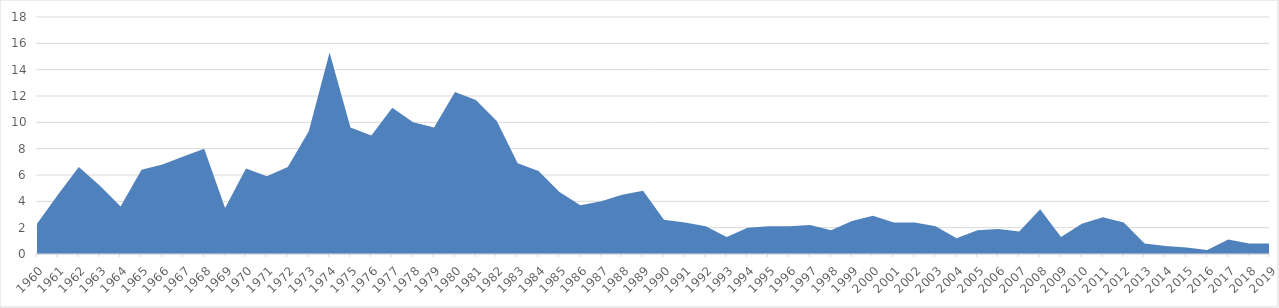
| Category | Series 0 |
|---|---|
| 1960 | 2.3 |
| 1961 | 4.5 |
| 1962 | 6.6 |
| 1963 | 5.2 |
| 1964 | 3.6 |
| 1965 | 6.4 |
| 1966 | 6.8 |
| 1967 | 7.4 |
| 1968 | 8 |
| 1969 | 3.5 |
| 1970 | 6.5 |
| 1971 | 5.9 |
| 1972 | 6.6 |
| 1973 | 9.3 |
| 1974 | 15.3 |
| 1975 | 9.6 |
| 1976 | 9 |
| 1977 | 11.1 |
| 1978 | 10 |
| 1979 | 9.6 |
| 1980 | 12.3 |
| 1981 | 11.7 |
| 1982 | 10.1 |
| 1983 | 6.9 |
| 1984 | 6.3 |
| 1985 | 4.7 |
| 1986 | 3.7 |
| 1987 | 4 |
| 1988 | 4.5 |
| 1989 | 4.8 |
| 1990 | 2.6 |
| 1991 | 2.4 |
| 1992 | 2.1 |
| 1993 | 1.3 |
| 1994 | 2 |
| 1995 | 2.1 |
| 1996 | 2.1 |
| 1997 | 2.2 |
| 1998 | 1.8 |
| 1999 | 2.5 |
| 2000 | 2.9 |
| 2001 | 2.4 |
| 2002 | 2.4 |
| 2003 | 2.1 |
| 2004 | 1.2 |
| 2005 | 1.8 |
| 2006 | 1.9 |
| 2007 | 1.7 |
| 2008 | 3.4 |
| 2009 | 1.3 |
| 2010 | 2.3 |
| 2011 | 2.8 |
| 2012 | 2.4 |
| 2013 | 0.8 |
| 2014 | 0.6 |
| 2015 | 0.5 |
| 2016 | 0.3 |
| 2017 | 1.1 |
| 2018 | 0.8 |
| 2019 | 0.8 |